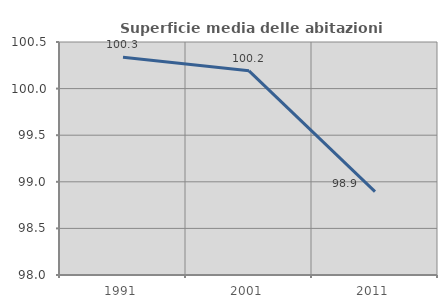
| Category | Superficie media delle abitazioni occupate |
|---|---|
| 1991.0 | 100.336 |
| 2001.0 | 100.19 |
| 2011.0 | 98.895 |